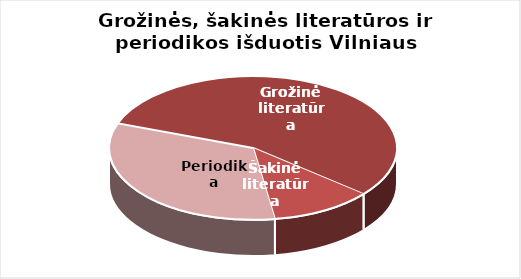
| Category | Series 0 |
|---|---|
| Grožinė literatūra | 1228453 |
| Šakinė literatūra | 253973 |
| Periodika | 729653 |